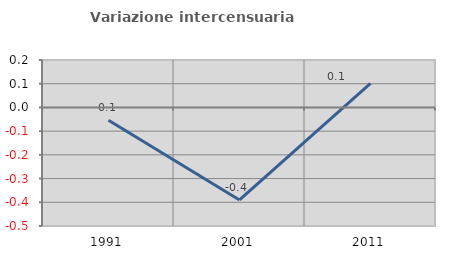
| Category | Variazione intercensuaria annua |
|---|---|
| 1991.0 | -0.054 |
| 2001.0 | -0.39 |
| 2011.0 | 0.102 |